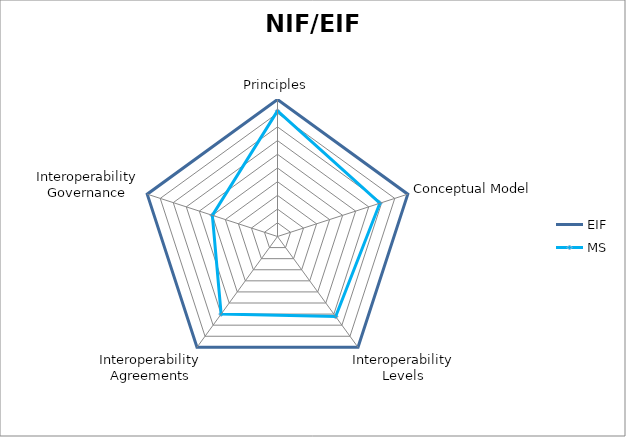
| Category | EIF | MS |
|---|---|---|
| Principles | 1 | 0.917 |
| Conceptual Model | 1 | 0.786 |
| Interoperability Levels | 1 | 0.722 |
| Interoperability Agreements | 1 | 0.7 |
| Interoperability Governance | 1 | 0.5 |